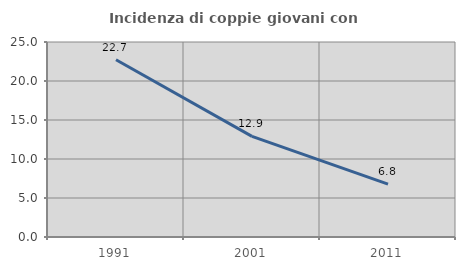
| Category | Incidenza di coppie giovani con figli |
|---|---|
| 1991.0 | 22.718 |
| 2001.0 | 12.903 |
| 2011.0 | 6.789 |